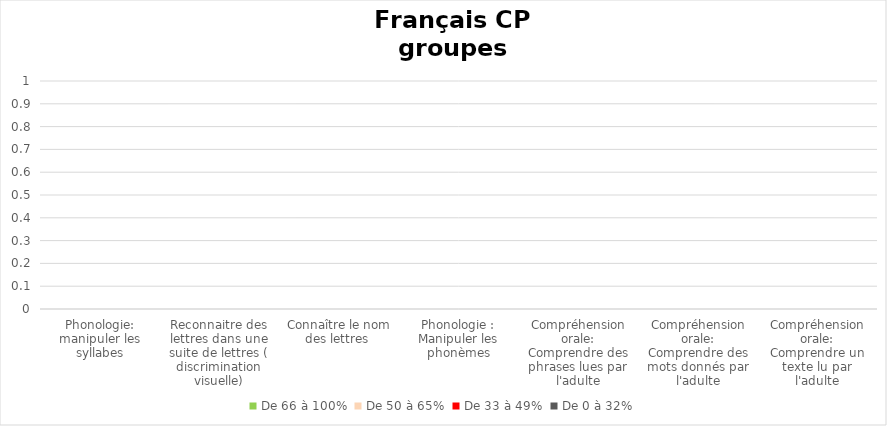
| Category | De 66 à 100% | De 50 à 65% | De 33 à 49% | De 0 à 32% |
|---|---|---|---|---|
| Phonologie: manipuler les syllabes | 0 | 0 | 0 | 0 |
| Reconnaitre des lettres dans une suite de lettres ( discrimination visuelle) | 0 | 0 | 0 | 0 |
| Connaître le nom des lettres  | 0 | 0 | 0 | 0 |
| Phonologie :
Manipuler les phonèmes | 0 | 0 | 0 | 0 |
| Compréhension orale:
Comprendre des phrases lues par l'adulte | 0 | 0 | 0 | 0 |
| Compréhension orale:
Comprendre des mots donnés par l'adulte | 0 | 0 | 0 | 0 |
| Compréhension orale:
Comprendre un texte lu par l'adulte | 0 | 0 | 0 | 0 |